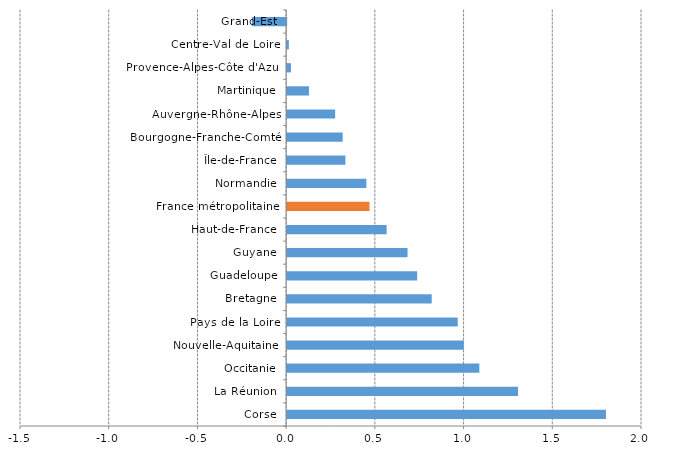
| Category | Series 0 |
|---|---|
| Corse | 1.797 |
| La Réunion | 1.301 |
| Occitanie | 1.083 |
| Nouvelle-Aquitaine | 0.996 |
| Pays de la Loire | 0.961 |
| Bretagne | 0.815 |
| Guadeloupe | 0.733 |
| Guyane | 0.679 |
| Haut-de-France | 0.561 |
| France métropolitaine | 0.464 |
| Normandie | 0.447 |
| Île-de-France | 0.328 |
| Bourgogne-Franche-Comté | 0.313 |
| Auvergne-Rhône-Alpes | 0.271 |
| Martinique | 0.123 |
| Provence-Alpes-Côte d'Azur | 0.021 |
| Centre-Val de Loire | 0.01 |
| Grand-Est | -0.193 |